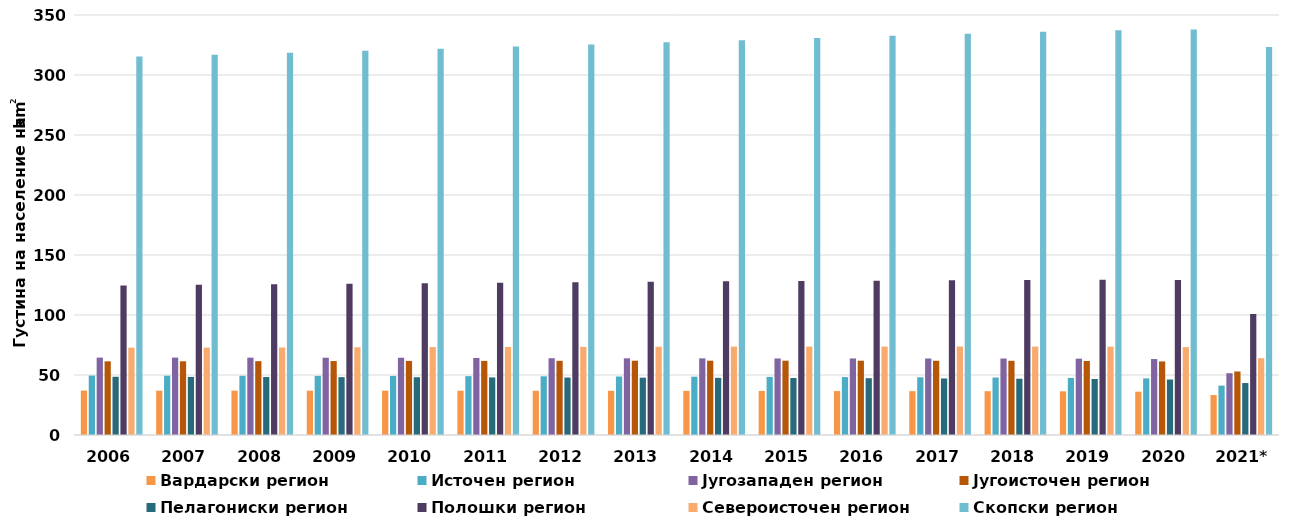
| Category | Вардарски регион | Источен регион | Југозападен регион | Југоисточен регион | Пелагониски регион | Полошки регион | Североисточен регион | Скопски регион |
|---|---|---|---|---|---|---|---|---|
| 2006 | 37.009 | 49.515 | 64.472 | 61.393 | 48.533 | 124.632 | 72.795 | 315.384 |
| 2007 | 36.953 | 49.414 | 64.495 | 61.454 | 48.385 | 125.135 | 72.822 | 316.977 |
| 2008 | 36.94 | 49.326 | 64.45 | 61.542 | 48.286 | 125.537 | 72.937 | 318.539 |
| 2009 | 36.931 | 49.256 | 64.402 | 61.616 | 48.216 | 125.972 | 73.13 | 320.214 |
| 2010 | 36.941 | 49.215 | 64.376 | 61.734 | 48.141 | 126.461 | 73.27 | 321.94 |
| 2011 | 36.914 | 49.046 | 64.204 | 61.755 | 48.008 | 126.903 | 73.317 | 323.647 |
| 2012 | 36.863 | 48.901 | 63.983 | 61.83 | 47.866 | 127.293 | 73.416 | 325.391 |
| 2013 | 36.832 | 48.747 | 63.908 | 61.894 | 47.762 | 127.681 | 73.543 | 327.245 |
| 2014 | 36.796 | 48.589 | 63.869 | 61.93 | 47.636 | 128.112 | 73.673 | 329.052 |
| 2015 | 36.71 | 48.443 | 63.769 | 61.923 | 47.486 | 128.42 | 73.696 | 330.792 |
| 2016 | 36.627 | 48.274 | 63.775 | 61.92 | 47.328 | 128.631 | 73.671 | 332.748 |
| 2017 | 36.55 | 48.098 | 63.753 | 61.87 | 47.117 | 128.93 | 73.709 | 334.332 |
| 2018 | 36.495 | 47.895 | 63.729 | 61.842 | 46.899 | 129.237 | 73.682 | 336.098 |
| 2019 | 36.368 | 47.601 | 63.613 | 61.663 | 46.677 | 129.451 | 73.589 | 337.377 |
| 2020 | 36.087 | 47.183 | 63.303 | 61.312 | 46.231 | 129.168 | 73.253 | 337.898 |
| 2021* | 33.303 | 41.146 | 51.486 | 52.944 | 43.301 | 100.856 | 63.974 | 323.384 |